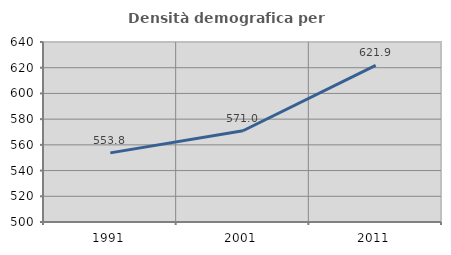
| Category | Densità demografica |
|---|---|
| 1991.0 | 553.762 |
| 2001.0 | 570.99 |
| 2011.0 | 621.865 |